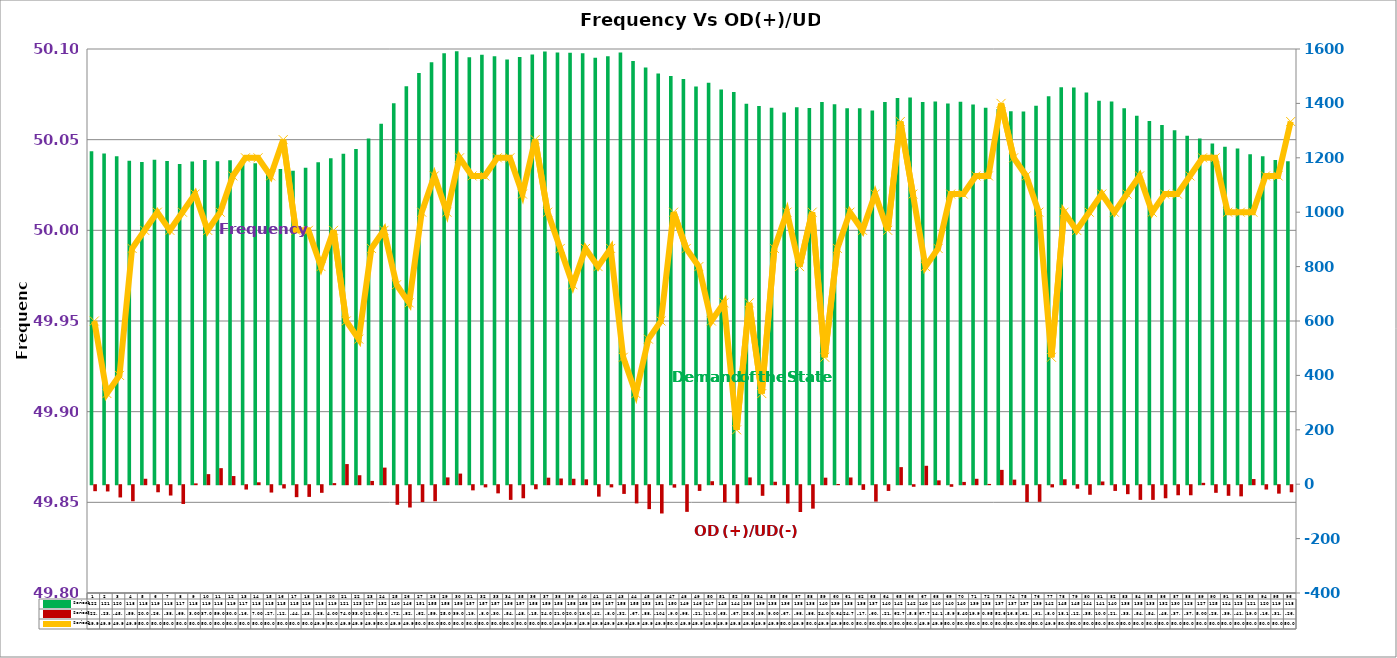
| Category | Series 2 | Series 4 |
|---|---|---|
| 0 | 1224 | -22 |
| 1 | 1216 | -23 |
| 2 | 1206 | -45 |
| 3 | 1189 | -59 |
| 4 | 1185 | 20 |
| 5 | 1193 | -26 |
| 6 | 1188 | -38 |
| 7 | 1177 | -69 |
| 8 | 1186 | 3 |
| 9 | 1192 | 37 |
| 10 | 1187 | 59 |
| 11 | 1191 | 30 |
| 12 | 1179 | -16 |
| 13 | 1180 | 7 |
| 14 | 1157 | -27 |
| 15 | 1159 | -12 |
| 16 | 1152 | -44 |
| 17 | 1163 | -43 |
| 18 | 1184 | -28 |
| 19 | 1198 | 4 |
| 20 | 1215 | 74 |
| 21 | 1232 | 33 |
| 22 | 1271 | 12 |
| 23 | 1325 | 61 |
| 24 | 1401 | -72 |
| 25 | 1463 | -82 |
| 26 | 1512 | -62 |
| 27 | 1551 | -59 |
| 28 | 1584 | 25 |
| 29 | 1592 | 39 |
| 30 | 1570 | -19 |
| 31 | 1579 | -8 |
| 32 | 1573 | -30 |
| 33 | 1561 | -54 |
| 34 | 1571 | -48 |
| 35 | 1580 | -15 |
| 36 | 1591 | 24 |
| 37 | 1587 | 21 |
| 38 | 1586 | 20 |
| 39 | 1584 | 18 |
| 40 | 1568 | -42 |
| 41 | 1573 | -8 |
| 42 | 1587 | -32 |
| 43 | 1556 | -67 |
| 44 | 1532 | -88 |
| 45 | 1509.6 | -104 |
| 46 | 1501 | -9 |
| 47 | 1490 | -98 |
| 48 | 1462.533 | -21 |
| 49 | 1476 | 11 |
| 50 | 1451 | -63 |
| 51 | 1442 | -67 |
| 52 | 1399 | 25 |
| 53 | 1390 | -39 |
| 54 | 1384 | 9 |
| 55 | 1367 | -67 |
| 56 | 1386 | -98.637 |
| 57 | 1383 | -86.207 |
| 58 | 1405 | 23.998 |
| 59 | 1397 | 0.642 |
| 60 | 1382 | 24.767 |
| 61 | 1382 | -17.173 |
| 62 | 1374 | -60.311 |
| 63 | 1405 | -21.009 |
| 64 | 1420 | 62.784 |
| 65 | 1422 | -5.796 |
| 66 | 1405 | 67.714 |
| 67 | 1407 | 14.144 |
| 68 | 1400 | -5.917 |
| 69 | 1406 | 8.401 |
| 70 | 1396 | 19.923 |
| 71 | 1384 | 0.948 |
| 72 | 1379 | 52.694 |
| 73 | 1371 | 16.804 |
| 74 | 1370 | -61.959 |
| 75 | 1391 | -61.159 |
| 76 | 1426 | -8.064 |
| 77 | 1459 | 18.102 |
| 78 | 1458 | -12.868 |
| 79 | 1440 | -35.268 |
| 80 | 1410 | 10 |
| 81 | 1407 | -21 |
| 82 | 1382 | -33 |
| 83 | 1355 | -54 |
| 84 | 1335 | -54 |
| 85 | 1321 | -48 |
| 86 | 1301 | -37 |
| 87 | 1281 | -37 |
| 88 | 1271 | 5 |
| 89 | 1253 | -28 |
| 90 | 1241 | -39 |
| 91 | 1234 | -41 |
| 92 | 1213 | 19 |
| 93 | 1206 | -16 |
| 94 | 1192 | -31 |
| 95 | 1187 | -26 |